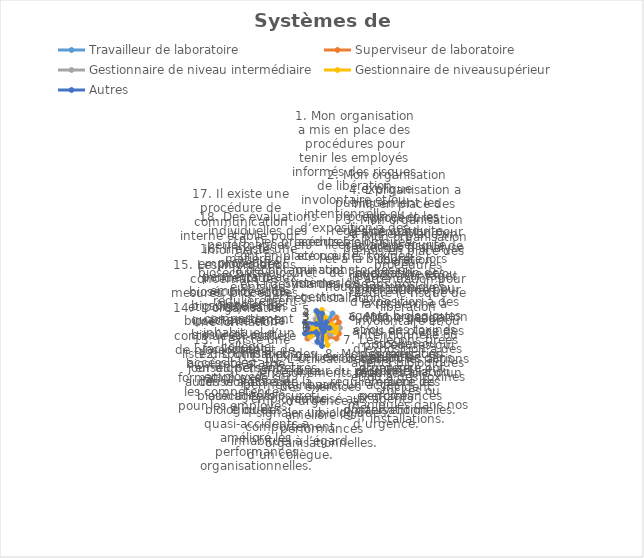
| Category | Travailleur de laboratoire | Superviseur de laboratoire | Gestionnaire de niveau intermédiaire | Gestionnaire de niveausupérieur | Autres |
|---|---|---|---|---|---|
| Systèmes de gestion | 3 | 3 | 1 | 5 | 4 |
| 1. Mon organisation a mis en place des procédures pour tenir les employés informés des risques de libération involontaire et/ou intentionnelle ou d’exposition à des agents biologiques et/ou à des toxines qui sont stockés ou manipulés dans nos installation | 0 | 1 | 1 | 3 | 0 |
| 2. Mon organisation explique publiquement les procédures et les règles de conduite liées à la biosécurité et à la biosûreté lors de l’orientation des nouveaux employés. | 5 | 1 | 2 | 1 | 2 |
| 3. Mon organisation a mis en place un processus d’analyse des risques-avantages systématique pour la recherche à double usage. | 2 | 5 | 0 | 1 | 1 |
| 4. L’organisation a mis en place des procédures d’atténuation pour réduire le risque de libération involontaire et/ou intentionnelle ou d’exposition à des agents biologiques et/ou des toxines stockés ou manipulés dans mon installation. | 2 | 5 | 0 | 3 | 1 |
| 5. Mon organisation a mis en place des procédures d’atténuation pour réduire le risque de libération involontaire et/ou intentionnelle ou d’exposition à des agents biologiques et/ou à des toxines stockés ou manipulés dans nos installations. | 0 | 2 | 5 | 4 | 2 |
| 6. Mon organisation a mis en place des procédures qui détaillent les actions requises lors d’un incident. | 1 | 5 | 3 | 4 | 0 |
| 7. Les leçons tirées des exercices d’urgence ont amélioré les performances organisationnelles. | 1 | 5 | 3 | 1 | 0 |
| 8. Mon organisation organise régulièrement des exercices d’intervention d’urgence. | 1 | 3 | 1 | 1 | 1 |
| 9. Il existe une liste à jour du personnel ayant un accès autorisé aux agents biologiques. | 3 | 0 | 3 | 5 | 1 |
| 10. L’utilisation des enseignements tirés des exercices d’urgence a amélioré les performances organisationnelles. | 3 | 1 | 0 | 0 | 5 |
| 11. Il existe une procédure permettant aux employés de signaler un comportement inhabituel à l’égard d’un collègue. | 2 | 4 | 4 | 1 | 4 |
| 12. L’utilisation des enseignements tirés des violations de la biosécurité/biosûreté ou des quasi-accidents a amélioré les performances organisationnelles. | 2 | 2 | 2 | 0 | 2 |
| 13. Il existe une liste disponible et à jour du personnel autorisé à accéder aux agents biologiques. | 0 | 5 | 4 | 4 | 2 |
| 14.  L’organisation a une formation continue en matière de biosécurité et de biosûreté et une formation axée sur les compétences pour les employés. | 4 | 4 | 2 | 2 | 5 |
| 15. Les informations concernant les mesures, procédures et politiques de biosécurité et de biosûreté sont facilement accessibles aux employés. | 3 | 0 | 1 | 4 | 4 |
| 16. Il existe une procédure permettant aux employés de signaler le comportement inhabituel d’un collègue. | 1 | 5 | 3 | 0 | 5 |
| 17. Il existe une procédure de communication interne établie pour informer les employés des incidents de biosécurité et de biosûreté et des quasi-accidents. | 0 | 2 | 0 | 2 | 2 |
| 18. Des évaluations individuelles des performances en matière de biosécurité/biosûreté ont lieu régulièrement. | 1 | 1 | 3 | 2 | 0 |
| 19. Des procédures sont en place pour la décontamination et la gestion des déchets. | 4 | 0 | 2 | 4 | 5 |